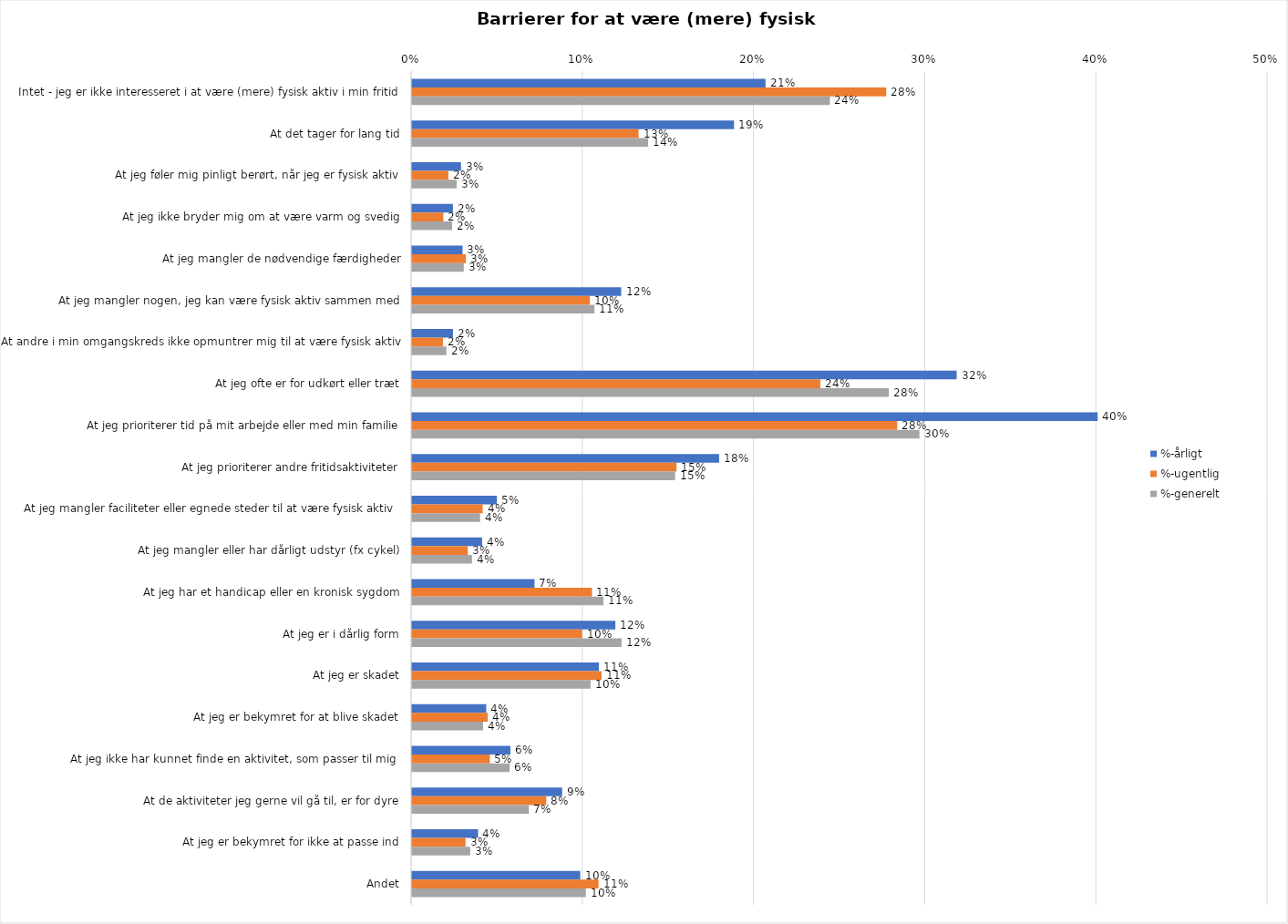
| Category | %-årligt | %-ugentlig | %-generelt |
|---|---|---|---|
| Intet - jeg er ikke interesseret i at være (mere) fysisk aktiv i min fritid | 0.207 | 0.277 | 0.244 |
| At det tager for lang tid | 0.188 | 0.132 | 0.138 |
| At jeg føler mig pinligt berørt, når jeg er fysisk aktiv | 0.029 | 0.021 | 0.026 |
| At jeg ikke bryder mig om at være varm og svedig | 0.024 | 0.018 | 0.023 |
| At jeg mangler de nødvendige færdigheder | 0.03 | 0.031 | 0.03 |
| At jeg mangler nogen, jeg kan være fysisk aktiv sammen med | 0.122 | 0.104 | 0.107 |
| At andre i min omgangskreds ikke opmuntrer mig til at være fysisk aktiv | 0.024 | 0.018 | 0.02 |
| At jeg ofte er for udkørt eller træt | 0.318 | 0.239 | 0.279 |
| At jeg prioriterer tid på mit arbejde eller med min familie | 0.401 | 0.283 | 0.296 |
| At jeg prioriterer andre fritidsaktiviteter | 0.179 | 0.155 | 0.154 |
| At jeg mangler faciliteter eller egnede steder til at være fysisk aktiv  | 0.05 | 0.041 | 0.04 |
| At jeg mangler eller har dårligt udstyr (fx cykel) | 0.041 | 0.033 | 0.035 |
| At jeg har et handicap eller en kronisk sygdom | 0.072 | 0.105 | 0.112 |
| At jeg er i dårlig form | 0.119 | 0.099 | 0.122 |
| At jeg er skadet | 0.109 | 0.111 | 0.104 |
| At jeg er bekymret for at blive skadet | 0.043 | 0.044 | 0.041 |
| At jeg ikke har kunnet finde en aktivitet, som passer til mig  | 0.057 | 0.045 | 0.057 |
| At de aktiviteter jeg gerne vil gå til, er for dyre | 0.088 | 0.078 | 0.068 |
| At jeg er bekymret for ikke at passe ind | 0.039 | 0.031 | 0.034 |
| Andet | 0.098 | 0.109 | 0.102 |